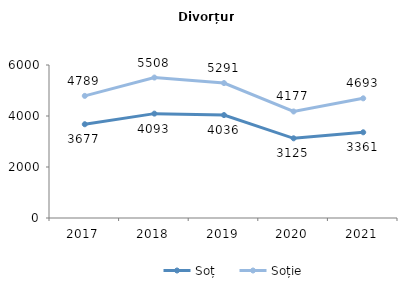
| Category | Soț | Soție |
|---|---|---|
| 2017.0 | 3677 | 4789 |
| 2018.0 | 4093 | 5508 |
| 2019.0 | 4036 | 5291 |
| 2020.0 | 3125 | 4177 |
| 2021.0 | 3361 | 4693 |